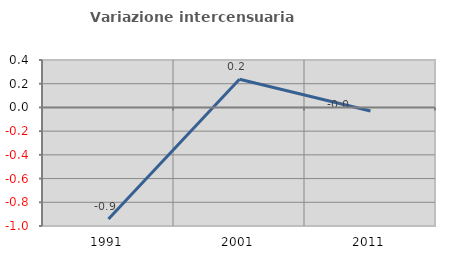
| Category | Variazione intercensuaria annua |
|---|---|
| 1991.0 | -0.94 |
| 2001.0 | 0.237 |
| 2011.0 | -0.03 |